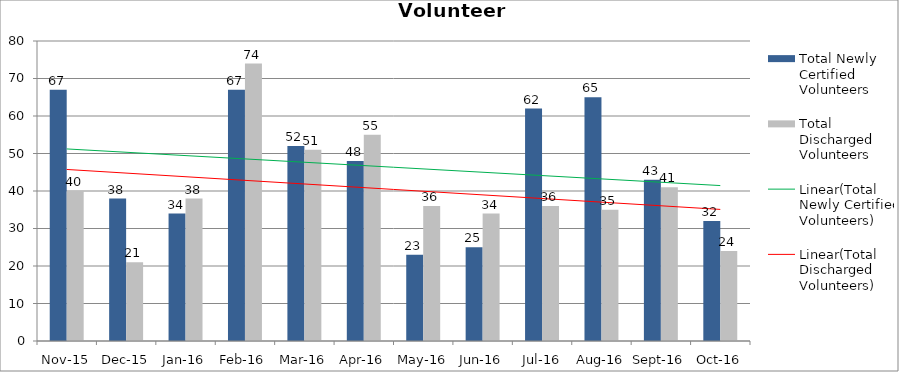
| Category | Total Newly Certified Volunteers | Total Discharged Volunteers |
|---|---|---|
| Nov-15 | 67 | 40 |
| Dec-15 | 38 | 21 |
| Jan-16 | 34 | 38 |
| Feb-16 | 67 | 74 |
| Mar-16 | 52 | 51 |
| Apr-16 | 48 | 55 |
| May-16 | 23 | 36 |
| Jun-16 | 25 | 34 |
| Jul-16 | 62 | 36 |
| Aug-16 | 65 | 35 |
| Sep-16 | 43 | 41 |
| Oct-16 | 32 | 24 |